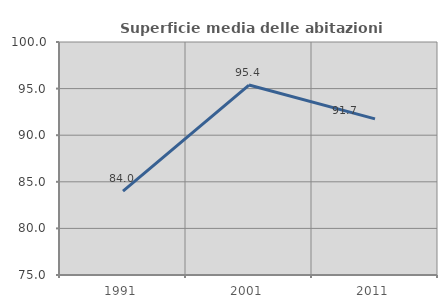
| Category | Superficie media delle abitazioni occupate |
|---|---|
| 1991.0 | 83.997 |
| 2001.0 | 95.383 |
| 2011.0 | 91.749 |